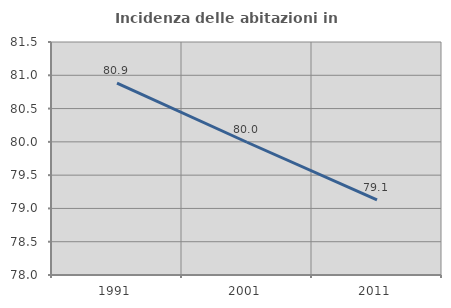
| Category | Incidenza delle abitazioni in proprietà  |
|---|---|
| 1991.0 | 80.881 |
| 2001.0 | 79.994 |
| 2011.0 | 79.128 |